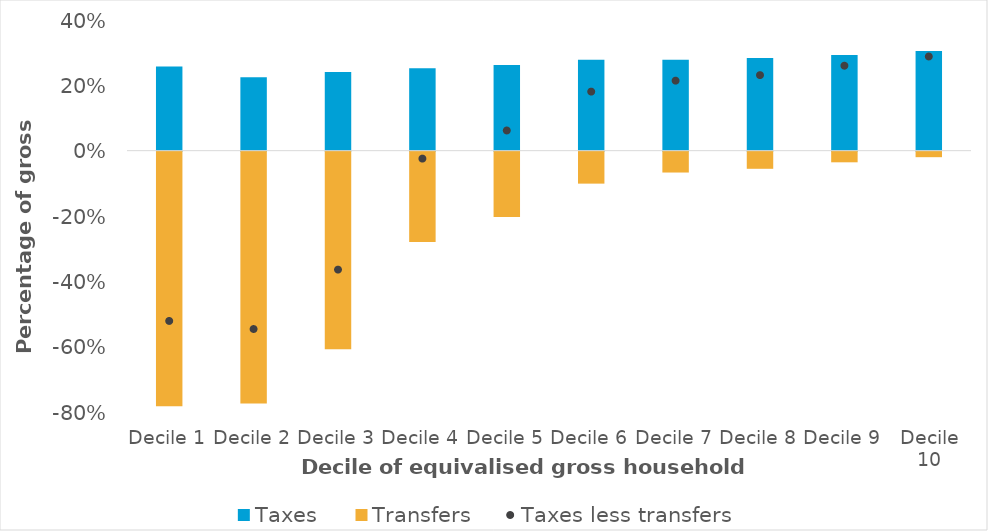
| Category | Taxes  | Transfers |
|---|---|---|
| Decile 1 | 0.258 | -0.779 |
| Decile 2 | 0.225 | -0.771 |
| Decile 3 | 0.241 | -0.605 |
| Decile 4 | 0.252 | -0.276 |
| Decile 5 | 0.262 | -0.2 |
| Decile 6 | 0.279 | -0.098 |
| Decile 7 | 0.278 | -0.064 |
| Decile 8 | 0.284 | -0.052 |
| Decile 9 | 0.293 | -0.033 |
| Decile 10 | 0.305 | -0.017 |